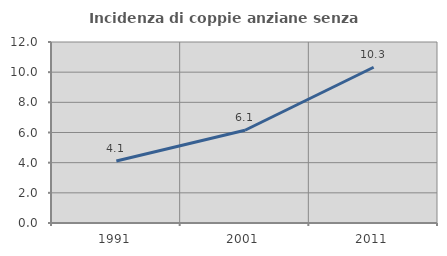
| Category | Incidenza di coppie anziane senza figli  |
|---|---|
| 1991.0 | 4.106 |
| 2001.0 | 6.149 |
| 2011.0 | 10.327 |